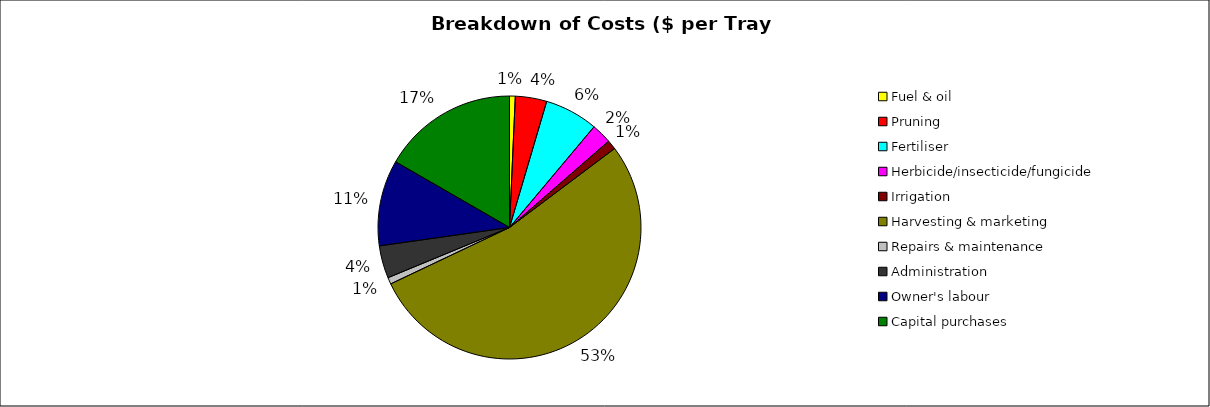
| Category | Series 0 |
|---|---|
| Fuel & oil | 0.085 |
| Pruning | 0.462 |
| Fertiliser | 0.784 |
| Herbicide/insecticide/fungicide | 0.297 |
| Irrigation | 0.138 |
| Harvesting & marketing | 6.369 |
| Repairs & maintenance | 0.098 |
| Administration | 0.479 |
| Owner's labour | 1.266 |
| Capital purchases | 1.996 |